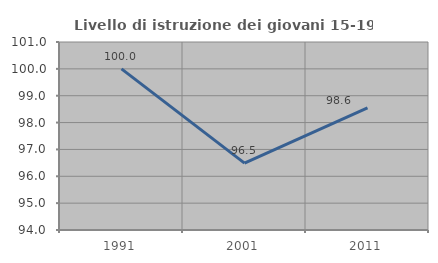
| Category | Livello di istruzione dei giovani 15-19 anni |
|---|---|
| 1991.0 | 100 |
| 2001.0 | 96.491 |
| 2011.0 | 98.551 |